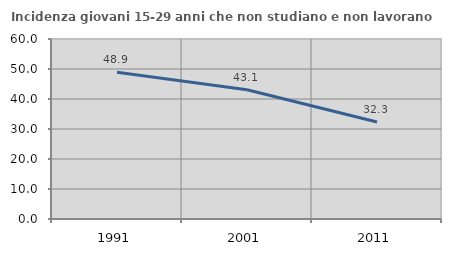
| Category | Incidenza giovani 15-29 anni che non studiano e non lavorano  |
|---|---|
| 1991.0 | 48.944 |
| 2001.0 | 43.108 |
| 2011.0 | 32.344 |